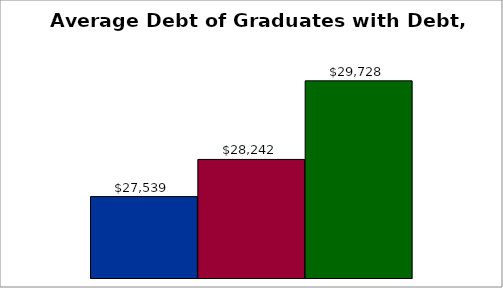
| Category | 50 states and D.C. | SREB states | State |
|---|---|---|---|
| 0 | 27539 | 28242 | 29728 |